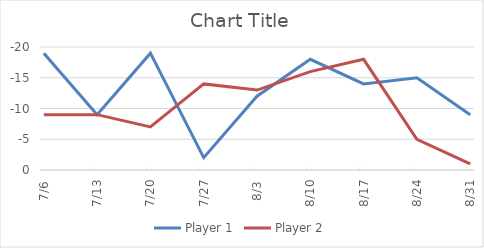
| Category | Player 1 | Player 2 |
|---|---|---|
| 2014-07-06 | -19 | -9 |
| 2014-07-13 | -9 | -9 |
| 2014-07-20 | -19 | -7 |
| 2014-07-27 | -2 | -14 |
| 2014-08-03 | -12 | -13 |
| 2014-08-10 | -18 | -16 |
| 2014-08-17 | -14 | -18 |
| 2014-08-24 | -15 | -5 |
| 2014-08-31 | -9 | -1 |